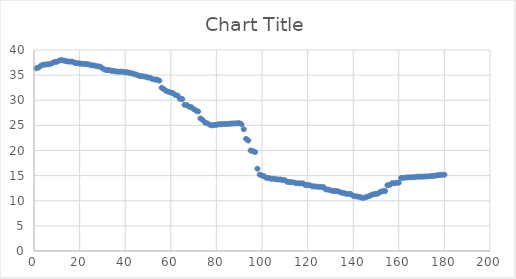
| Category | Series 0 |
|---|---|
| 1.0 | 36.363 |
| 2.0 | 36.496 |
| 3.0 | 36.864 |
| 4.0 | 37.076 |
| 5.0 | 37.094 |
| 6.0 | 37.159 |
| 7.0 | 37.195 |
| 8.0 | 37.387 |
| 9.0 | 37.632 |
| 10.0 | 37.639 |
| 11.0 | 37.884 |
| 12.0 | 37.999 |
| 13.0 | 37.899 |
| 14.0 | 37.796 |
| 15.0 | 37.701 |
| 16.0 | 37.691 |
| 17.0 | 37.663 |
| 18.0 | 37.417 |
| 19.0 | 37.381 |
| 20.0 | 37.323 |
| 21.0 | 37.263 |
| 22.0 | 37.235 |
| 23.0 | 37.199 |
| 24.0 | 37.133 |
| 25.0 | 36.982 |
| 26.0 | 36.937 |
| 27.0 | 36.856 |
| 28.0 | 36.74 |
| 29.0 | 36.703 |
| 30.0 | 36.363 |
| 31.0 | 36.1 |
| 32.0 | 36.002 |
| 33.0 | 35.995 |
| 34.0 | 35.853 |
| 35.0 | 35.825 |
| 36.0 | 35.723 |
| 37.0 | 35.692 |
| 38.0 | 35.688 |
| 39.0 | 35.655 |
| 40.0 | 35.56 |
| 41.0 | 35.555 |
| 42.0 | 35.454 |
| 43.0 | 35.357 |
| 44.0 | 35.182 |
| 45.0 | 35.086 |
| 46.0 | 34.879 |
| 47.0 | 34.783 |
| 48.0 | 34.756 |
| 49.0 | 34.669 |
| 50.0 | 34.525 |
| 51.0 | 34.448 |
| 52.0 | 34.207 |
| 53.0 | 34.13 |
| 54.0 | 34.09 |
| 55.0 | 33.906 |
| 56.0 | 32.486 |
| 57.0 | 32.21 |
| 58.0 | 31.824 |
| 59.0 | 31.696 |
| 60.0 | 31.535 |
| 61.0 | 31.384 |
| 62.0 | 31.068 |
| 63.0 | 30.927 |
| 64.0 | 30.277 |
| 65.0 | 30.248 |
| 66.0 | 29.09 |
| 67.0 | 29.041 |
| 68.0 | 28.736 |
| 69.0 | 28.62 |
| 70.0 | 28.256 |
| 71.0 | 27.95 |
| 72.0 | 27.78 |
| 73.0 | 26.371 |
| 74.0 | 26.071 |
| 75.0 | 25.558 |
| 76.0 | 25.403 |
| 77.0 | 25.154 |
| 78.0 | 24.999 |
| 79.0 | 25.083 |
| 80.0 | 25.108 |
| 81.0 | 25.218 |
| 82.0 | 25.227 |
| 83.0 | 25.262 |
| 84.0 | 25.277 |
| 85.0 | 25.28 |
| 86.0 | 25.338 |
| 87.0 | 25.366 |
| 88.0 | 25.39 |
| 89.0 | 25.411 |
| 90.0 | 25.454 |
| 91.0 | 25.221 |
| 92.0 | 24.216 |
| 93.0 | 22.32 |
| 94.0 | 21.985 |
| 95.0 | 20.005 |
| 96.0 | 19.889 |
| 97.0 | 19.684 |
| 98.0 | 16.377 |
| 99.0 | 15.195 |
| 100.0 | 15.008 |
| 101.0 | 14.858 |
| 102.0 | 14.545 |
| 103.0 | 14.521 |
| 104.0 | 14.38 |
| 105.0 | 14.379 |
| 106.0 | 14.293 |
| 107.0 | 14.236 |
| 108.0 | 14.226 |
| 109.0 | 14.11 |
| 110.0 | 14.107 |
| 111.0 | 13.772 |
| 112.0 | 13.724 |
| 113.0 | 13.701 |
| 114.0 | 13.636 |
| 115.0 | 13.483 |
| 116.0 | 13.477 |
| 117.0 | 13.457 |
| 118.0 | 13.455 |
| 119.0 | 13.14 |
| 120.0 | 13.12 |
| 121.0 | 13.082 |
| 122.0 | 12.885 |
| 123.0 | 12.848 |
| 124.0 | 12.803 |
| 125.0 | 12.782 |
| 126.0 | 12.727 |
| 127.0 | 12.705 |
| 128.0 | 12.259 |
| 129.0 | 12.22 |
| 130.0 | 12.082 |
| 131.0 | 11.952 |
| 132.0 | 11.932 |
| 133.0 | 11.908 |
| 134.0 | 11.762 |
| 135.0 | 11.591 |
| 136.0 | 11.508 |
| 137.0 | 11.384 |
| 138.0 | 11.363 |
| 139.0 | 11.325 |
| 140.0 | 10.961 |
| 141.0 | 10.868 |
| 142.0 | 10.842 |
| 143.0 | 10.731 |
| 144.0 | 10.575 |
| 145.0 | 10.616 |
| 146.0 | 10.787 |
| 147.0 | 10.908 |
| 148.0 | 11.157 |
| 149.0 | 11.301 |
| 150.0 | 11.363 |
| 151.0 | 11.467 |
| 152.0 | 11.771 |
| 153.0 | 11.908 |
| 154.0 | 11.93 |
| 155.0 | 13.079 |
| 156.0 | 13.149 |
| 157.0 | 13.483 |
| 158.0 | 13.484 |
| 159.0 | 13.585 |
| 160.0 | 13.594 |
| 161.0 | 14.542 |
| 162.0 | 14.545 |
| 163.0 | 14.622 |
| 164.0 | 14.645 |
| 165.0 | 14.667 |
| 166.0 | 14.667 |
| 167.0 | 14.689 |
| 168.0 | 14.781 |
| 169.0 | 14.785 |
| 170.0 | 14.791 |
| 171.0 | 14.818 |
| 172.0 | 14.839 |
| 173.0 | 14.853 |
| 174.0 | 14.921 |
| 175.0 | 14.957 |
| 176.0 | 14.972 |
| 177.0 | 15.091 |
| 178.0 | 15.108 |
| 179.0 | 15.172 |
| 180.0 | 15.183 |